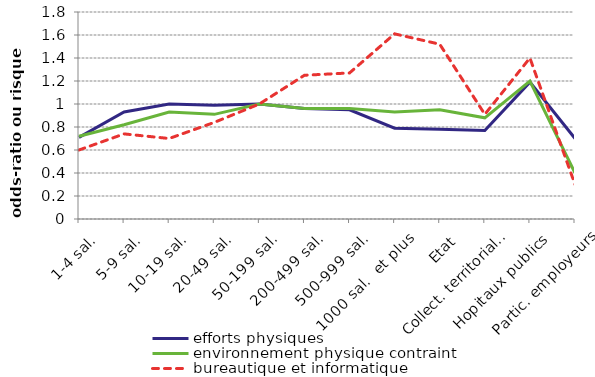
| Category | efforts physiques | environnement physique contraint | bureautique et informatique |
|---|---|---|---|
|  1-4 sal. | 0.71 | 0.72 | 0.6 |
|  5-9 sal. | 0.93 | 0.82 | 0.74 |
|  10-19 sal. | 1 | 0.93 | 0.7 |
| 20-49 sal. | 0.99 | 0.91 | 0.84 |
|  50-199 sal. | 1 | 1 | 1 |
|  200-499 sal. | 0.96 | 0.96 | 1.25 |
|  500-999 sal. | 0.95 | 0.96 | 1.27 |
|  1000 sal.  et plus | 0.79 | 0.93 | 1.61 |
| Etat | 0.78 | 0.95 | 1.52 |
| Collect. territoriales | 0.77 | 0.88 | 0.91 |
| Hopitaux publics | 1.19 | 1.2 | 1.4 |
| Partic. employeurs | 0.7 | 0.4 | 0.3 |